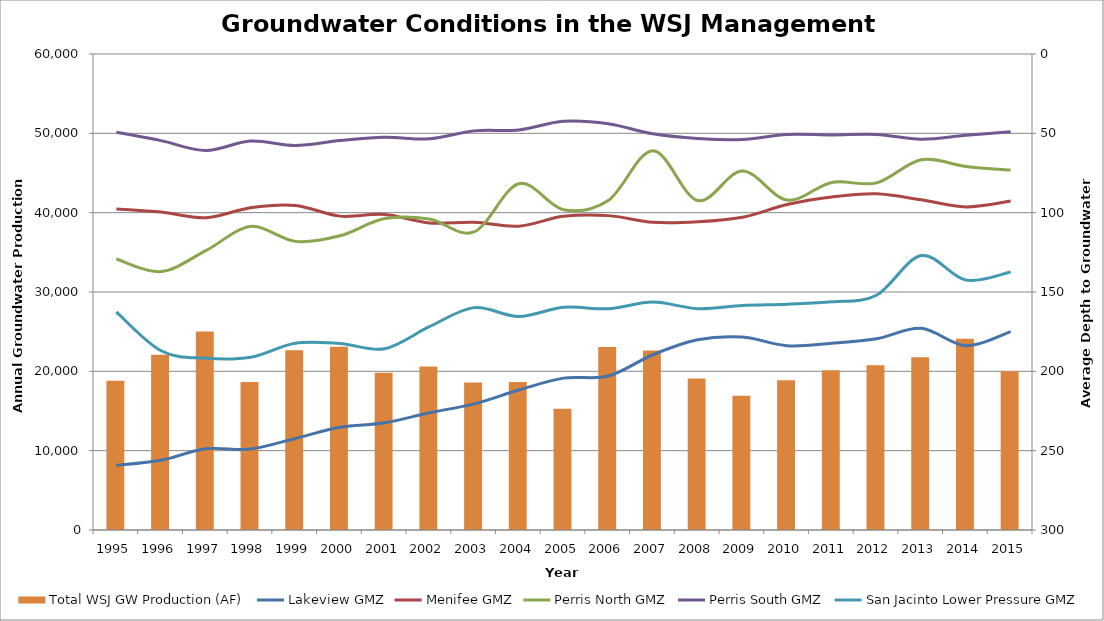
| Category | Total WSJ GW Production (AF) |
|---|---|
| 1995.0 | 18810.3 |
| 1996.0 | 22084.03 |
| 1997.0 | 25007.26 |
| 1998.0 | 18660.56 |
| 1999.0 | 22652.55 |
| 2000.0 | 23102.76 |
| 2001.0 | 19830.982 |
| 2002.0 | 20606.067 |
| 2003.0 | 18579.559 |
| 2004.0 | 18648.605 |
| 2005.0 | 15297.609 |
| 2006.0 | 23053.89 |
| 2007.0 | 22625.903 |
| 2008.0 | 19084.038 |
| 2009.0 | 16924.123 |
| 2010.0 | 18867.86 |
| 2011.0 | 20127.181 |
| 2012.0 | 20754.879 |
| 2013.0 | 21767.35 |
| 2014.0 | 24112.511 |
| 2015.0 | 20004.033 |